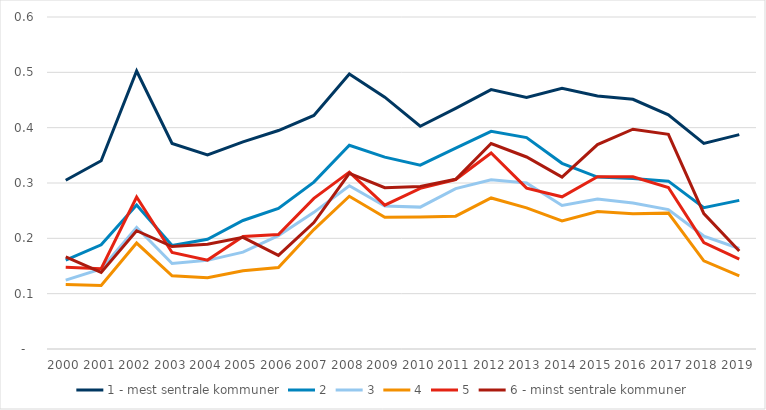
| Category | 1 - mest sentrale kommuner | 2 | 3 | 4 | 5 | 6 - minst sentrale kommuner |
|---|---|---|---|---|---|---|
| 2000.0 | 0.305 | 0.161 | 0.125 | 0.117 | 0.148 | 0.167 |
| 2001.0 | 0.34 | 0.188 | 0.145 | 0.115 | 0.145 | 0.138 |
| 2002.0 | 0.502 | 0.26 | 0.219 | 0.192 | 0.275 | 0.214 |
| 2003.0 | 0.371 | 0.187 | 0.155 | 0.132 | 0.174 | 0.185 |
| 2004.0 | 0.351 | 0.198 | 0.16 | 0.129 | 0.161 | 0.189 |
| 2005.0 | 0.374 | 0.232 | 0.175 | 0.141 | 0.203 | 0.202 |
| 2006.0 | 0.395 | 0.254 | 0.205 | 0.147 | 0.207 | 0.169 |
| 2007.0 | 0.422 | 0.302 | 0.247 | 0.216 | 0.272 | 0.228 |
| 2008.0 | 0.497 | 0.368 | 0.295 | 0.276 | 0.32 | 0.317 |
| 2009.0 | 0.455 | 0.347 | 0.258 | 0.238 | 0.26 | 0.292 |
| 2010.0 | 0.403 | 0.332 | 0.256 | 0.239 | 0.29 | 0.294 |
| 2011.0 | 0.435 | 0.363 | 0.29 | 0.24 | 0.306 | 0.307 |
| 2012.0 | 0.469 | 0.393 | 0.306 | 0.273 | 0.354 | 0.371 |
| 2013.0 | 0.454 | 0.382 | 0.3 | 0.255 | 0.291 | 0.347 |
| 2014.0 | 0.471 | 0.336 | 0.259 | 0.231 | 0.275 | 0.311 |
| 2015.0 | 0.457 | 0.311 | 0.271 | 0.248 | 0.311 | 0.369 |
| 2016.0 | 0.451 | 0.308 | 0.264 | 0.245 | 0.311 | 0.397 |
| 2017.0 | 0.423 | 0.303 | 0.252 | 0.246 | 0.292 | 0.388 |
| 2018.0 | 0.372 | 0.255 | 0.204 | 0.159 | 0.192 | 0.245 |
| 2019.0 | 0.387 | 0.269 | 0.182 | 0.132 | 0.162 | 0.177 |